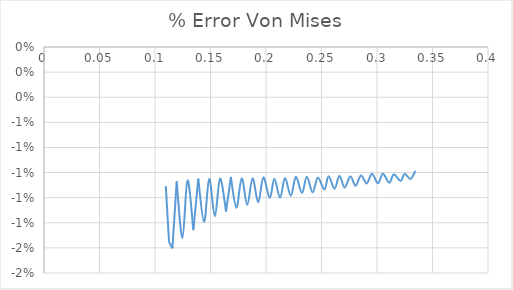
| Category | % Error Von Mises |
|---|---|
| 0.109716 | -0.011 |
| 0.112628 | -0.016 |
| 0.115707 | -0.016 |
| 0.119541 | -0.011 |
| 0.124653 | -0.015 |
| 0.1293 | -0.011 |
| 0.134573 | -0.015 |
| 0.138988 | -0.01 |
| 0.14417 | -0.014 |
| 0.148817 | -0.011 |
| 0.15391 | -0.013 |
| 0.158615 | -0.01 |
| 0.164018 | -0.013 |
| 0.168327 | -0.01 |
| 0.173323 | -0.013 |
| 0.178096 | -0.01 |
| 0.183063 | -0.013 |
| 0.187856 | -0.01 |
| 0.192984 | -0.012 |
| 0.197632 | -0.01 |
| 0.203366 | -0.012 |
| 0.207549 | -0.01 |
| 0.212661 | -0.012 |
| 0.217134 | -0.01 |
| 0.22232 | -0.012 |
| 0.226967 | -0.01 |
| 0.232378 | -0.012 |
| 0.236822 | -0.01 |
| 0.241973 | -0.012 |
| 0.246678 | -0.01 |
| 0.252614 | -0.011 |
| 0.25639 | -0.01 |
| 0.261715 | -0.011 |
| 0.266159 | -0.01 |
| 0.270836 | -0.011 |
| 0.275991 | -0.01 |
| 0.280696 | -0.011 |
| 0.285576 | -0.01 |
| 0.290731 | -0.011 |
| 0.295494 | -0.01 |
| 0.300839 | -0.011 |
| 0.305299 | -0.01 |
| 0.310992 | -0.011 |
| 0.315145 | -0.01 |
| 0.321254 | -0.011 |
| 0.324943 | -0.01 |
| 0.330152 | -0.011 |
| 0.334621 | -0.01 |